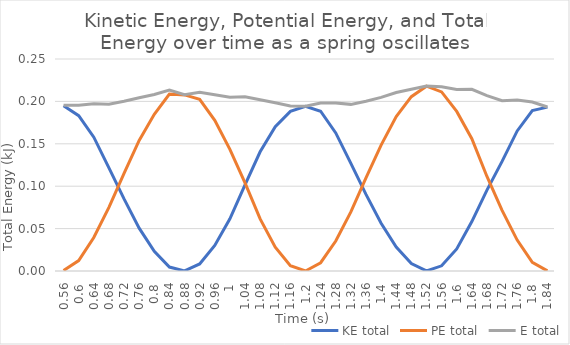
| Category | KE total | PE total | E total |
|---|---|---|---|
| 0.56 | 0.195 | 0.001 | 0.196 |
| 0.6 | 0.183 | 0.012 | 0.195 |
| 0.64 | 0.158 | 0.039 | 0.197 |
| 0.68 | 0.122 | 0.075 | 0.197 |
| 0.72 | 0.085 | 0.115 | 0.2 |
| 0.76 | 0.05 | 0.154 | 0.204 |
| 0.8 | 0.023 | 0.185 | 0.208 |
| 0.84 | 0.005 | 0.209 | 0.213 |
| 0.88 | 0 | 0.208 | 0.208 |
| 0.92 | 0.008 | 0.202 | 0.211 |
| 0.96 | 0.03 | 0.178 | 0.208 |
| 1.0 | 0.062 | 0.144 | 0.205 |
| 1.04 | 0.102 | 0.104 | 0.206 |
| 1.08 | 0.141 | 0.061 | 0.202 |
| 1.12 | 0.17 | 0.028 | 0.198 |
| 1.16 | 0.188 | 0.006 | 0.195 |
| 1.2 | 0.194 | 0 | 0.194 |
| 1.24 | 0.188 | 0.01 | 0.198 |
| 1.28 | 0.163 | 0.035 | 0.198 |
| 1.32 | 0.127 | 0.07 | 0.197 |
| 1.36 | 0.09 | 0.11 | 0.2 |
| 1.4 | 0.056 | 0.149 | 0.205 |
| 1.44 | 0.028 | 0.182 | 0.21 |
| 1.48 | 0.009 | 0.206 | 0.214 |
| 1.52 | 0 | 0.218 | 0.218 |
| 1.56 | 0.006 | 0.211 | 0.217 |
| 1.6 | 0.026 | 0.188 | 0.214 |
| 1.64 | 0.058 | 0.156 | 0.214 |
| 1.68 | 0.095 | 0.111 | 0.207 |
| 1.72 | 0.129 | 0.072 | 0.201 |
| 1.76 | 0.165 | 0.036 | 0.202 |
| 1.8 | 0.189 | 0.01 | 0.199 |
| 1.84 | 0.193 | 0 | 0.193 |